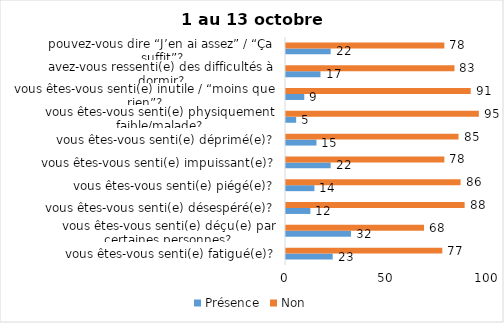
| Category | Présence | Non |
|---|---|---|
| vous êtes-vous senti(e) fatigué(e)? | 23 | 77 |
| vous êtes-vous senti(e) déçu(e) par certaines personnes? | 32 | 68 |
| vous êtes-vous senti(e) désespéré(e)? | 12 | 88 |
| vous êtes-vous senti(e) piégé(e)? | 14 | 86 |
| vous êtes-vous senti(e) impuissant(e)? | 22 | 78 |
| vous êtes-vous senti(e) déprimé(e)? | 15 | 85 |
| vous êtes-vous senti(e) physiquement faible/malade? | 5 | 95 |
| vous êtes-vous senti(e) inutile / “moins que rien”? | 9 | 91 |
| avez-vous ressenti(e) des difficultés à dormir? | 17 | 83 |
| pouvez-vous dire “J’en ai assez” / “Ça suffit”? | 22 | 78 |